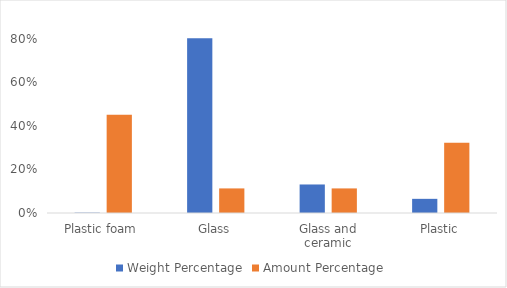
| Category | Weight Percentage | Amount Percentage  |
|---|---|---|
| Plastic foam | 0.002 | 0.452 |
| Glass | 0.802 | 0.113 |
| Glass and ceramic | 0.131 | 0.113 |
| Plastic | 0.065 | 0.323 |